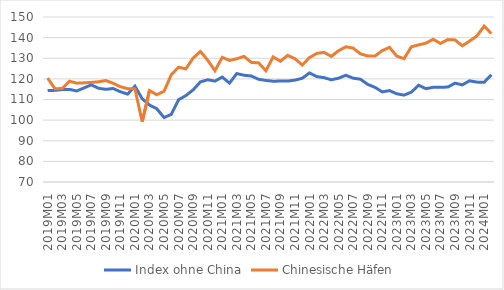
| Category | Index ohne China | Chinesische Häfen |
|---|---|---|
| 2019M01 | 114.328 | 120.367 |
| 2019M02 | 114.439 | 115.247 |
| 2019M03 | 114.834 | 115.294 |
| 2019M04 | 114.893 | 118.859 |
| 2019M05 | 114.135 | 117.929 |
| 2019M06 | 115.612 | 118.07 |
| 2019M07 | 117.095 | 118.286 |
| 2019M08 | 115.452 | 118.583 |
| 2019M09 | 114.914 | 119.189 |
| 2019M10 | 115.345 | 117.866 |
| 2019M11 | 113.746 | 116.203 |
| 2019M12 | 112.619 | 115.25 |
| 2020M01 | 116.451 | 115.158 |
| 2020M02 | 110.383 | 99.227 |
| 2020M03 | 107.334 | 114.341 |
| 2020M04 | 105.552 | 112.317 |
| 2020M05 | 101.254 | 113.986 |
| 2020M06 | 102.787 | 122.019 |
| 2020M07 | 109.859 | 125.677 |
| 2020M08 | 111.907 | 124.826 |
| 2020M09 | 114.658 | 130.106 |
| 2020M10 | 118.544 | 133.284 |
| 2020M11 | 119.577 | 129.091 |
| 2020M12 | 118.919 | 123.945 |
| 2021M01 | 120.867 | 130.453 |
| 2021M02 | 117.939 | 128.943 |
| 2021M03 | 122.575 | 129.73 |
| 2021M04 | 121.753 | 130.907 |
| 2021M05 | 121.396 | 127.99 |
| 2021M06 | 119.806 | 127.759 |
| 2021M07 | 119.231 | 123.944 |
| 2021M08 | 118.862 | 130.649 |
| 2021M09 | 118.948 | 128.545 |
| 2021M10 | 118.94 | 131.401 |
| 2021M11 | 119.397 | 129.779 |
| 2021M12 | 120.295 | 126.734 |
| 2022M01 | 122.89 | 130.324 |
| 2022M02 | 121.099 | 132.348 |
| 2022M03 | 120.59 | 132.851 |
| 2022M04 | 119.563 | 130.917 |
| 2022M05 | 120.335 | 133.682 |
| 2022M06 | 121.741 | 135.553 |
| 2022M07 | 120.344 | 134.918 |
| 2022M08 | 119.836 | 132.143 |
| 2022M09 | 117.334 | 131.121 |
| 2022M10 | 115.89 | 131.092 |
| 2022M11 | 113.691 | 133.722 |
| 2022M12 | 114.319 | 135.287 |
| 2023M01 | 112.753 | 131.019 |
| 2023M02 | 112.138 | 129.805 |
| 2023M03 | 113.561 | 135.559 |
| 2023M04 | 116.913 | 136.481 |
| 2023M05 | 115.246 | 137.309 |
| 2023M06 | 115.918 | 139.202 |
| 2023M07 | 115.985 | 137.184 |
| 2023M08 | 116.005 | 139.032 |
| 2023M09 | 117.925 | 138.893 |
| 2023M10 | 117.094 | 136.035 |
| 2023M11 | 119.065 | 138.309 |
| 2023M12 | 118.432 | 140.782 |
| 2024M01 | 118.317 | 145.587 |
| 2024M02 | 121.987 | 141.978 |